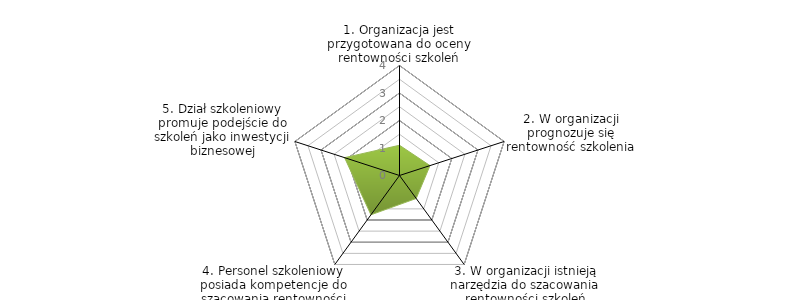
| Category | Series 0 | BENCHMARK |
|---|---|---|
| 1. Organizacja jest przygotowana do oceny rentowności szkoleń |  | 1.1 |
| 2. W organizacji prognozuje się rentowność szkolenia |  | 1.167 |
| 3. W organizacji istnieją narzędzia do szacowania rentowności szkoleń |  | 1.033 |
| 4. Personel szkoleniowy posiada kompetencje do szacowania rentowności szkoleń |  | 1.767 |
| 5. Dział szkoleniowy promuje podejście do szkoleń jako inwestycji biznesowej |  | 2.1 |